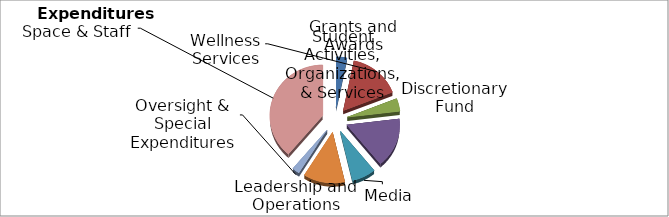
| Category | Series 0 |
|---|---|
| Grants and Awards | 22000 |
| Wellness Services | 107900 |
| Discretionary Fund | 27500 |
| Student Activities, Organizations, & Services | 108256 |
| Media | 49383 |
| Leadership and Operations | 86374.77 |
| Oversight & Special Expenditures | 15284 |
| Space & Staff | 263903 |